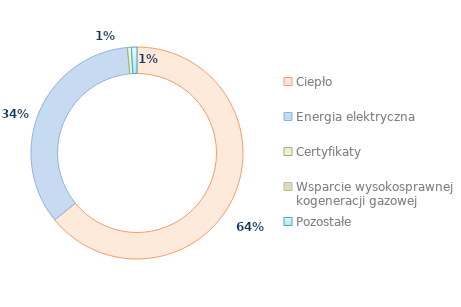
| Category | Series 0 |
|---|---|
| Ciepło | 64.019 |
| Energia elektryczna | 34.366 |
| Certyfikaty | 0.605 |
| Wsparcie wysokosprawnej kogeneracji gazowej | 0 |
| Pozostałe | 0.836 |